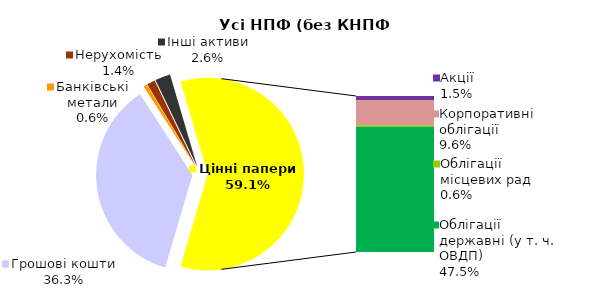
| Category | Усі НПФ (без КНПФ НБУ) |
|---|---|
| Грошові кошти | 859.613 |
| Банківські метали | 14.73 |
| Нерухомість | 32.61 |
| Інші активи | 61.105 |
| Акції | 34.977 |
| Корпоративні облігації | 227.286 |
| Облігації місцевих рад | 13.436 |
| Облігації державні (у т. ч. ОВДП) | 1123.783 |